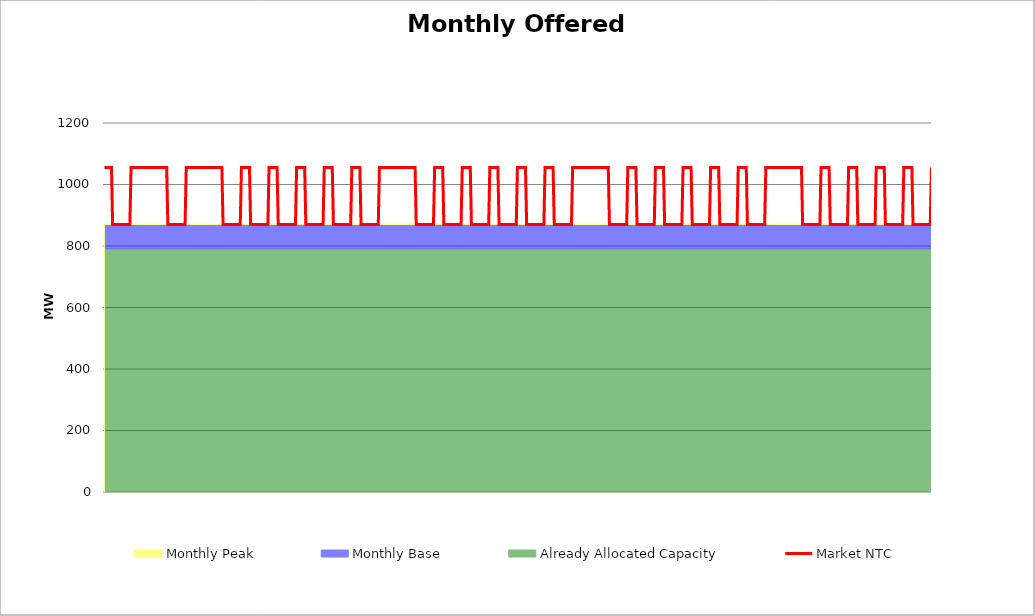
| Category | Market NTC |
|---|---|
| 0 | 1055 |
| 1 | 1055 |
| 2 | 1055 |
| 3 | 1055 |
| 4 | 1055 |
| 5 | 1055 |
| 6 | 1055 |
| 7 | 870 |
| 8 | 870 |
| 9 | 870 |
| 10 | 870 |
| 11 | 870 |
| 12 | 870 |
| 13 | 870 |
| 14 | 870 |
| 15 | 870 |
| 16 | 870 |
| 17 | 870 |
| 18 | 870 |
| 19 | 870 |
| 20 | 870 |
| 21 | 870 |
| 22 | 870 |
| 23 | 1055 |
| 24 | 1055 |
| 25 | 1055 |
| 26 | 1055 |
| 27 | 1055 |
| 28 | 1055 |
| 29 | 1055 |
| 30 | 1055 |
| 31 | 1055 |
| 32 | 1055 |
| 33 | 1055 |
| 34 | 1055 |
| 35 | 1055 |
| 36 | 1055 |
| 37 | 1055 |
| 38 | 1055 |
| 39 | 1055 |
| 40 | 1055 |
| 41 | 1055 |
| 42 | 1055 |
| 43 | 1055 |
| 44 | 1055 |
| 45 | 1055 |
| 46 | 1055 |
| 47 | 1055 |
| 48 | 1055 |
| 49 | 1055 |
| 50 | 1055 |
| 51 | 1055 |
| 52 | 1055 |
| 53 | 1055 |
| 54 | 1055 |
| 55 | 870 |
| 56 | 870 |
| 57 | 870 |
| 58 | 870 |
| 59 | 870 |
| 60 | 870 |
| 61 | 870 |
| 62 | 870 |
| 63 | 870 |
| 64 | 870 |
| 65 | 870 |
| 66 | 870 |
| 67 | 870 |
| 68 | 870 |
| 69 | 870 |
| 70 | 870 |
| 71 | 1055 |
| 72 | 1055 |
| 73 | 1055 |
| 74 | 1055 |
| 75 | 1055 |
| 76 | 1055 |
| 77 | 1055 |
| 78 | 1055 |
| 79 | 1055 |
| 80 | 1055 |
| 81 | 1055 |
| 82 | 1055 |
| 83 | 1055 |
| 84 | 1055 |
| 85 | 1055 |
| 86 | 1055 |
| 87 | 1055 |
| 88 | 1055 |
| 89 | 1055 |
| 90 | 1055 |
| 91 | 1055 |
| 92 | 1055 |
| 93 | 1055 |
| 94 | 1055 |
| 95 | 1055 |
| 96 | 1055 |
| 97 | 1055 |
| 98 | 1055 |
| 99 | 1055 |
| 100 | 1055 |
| 101 | 1055 |
| 102 | 1055 |
| 103 | 870 |
| 104 | 870 |
| 105 | 870 |
| 106 | 870 |
| 107 | 870 |
| 108 | 870 |
| 109 | 870 |
| 110 | 870 |
| 111 | 870 |
| 112 | 870 |
| 113 | 870 |
| 114 | 870 |
| 115 | 870 |
| 116 | 870 |
| 117 | 870 |
| 118 | 870 |
| 119 | 1055 |
| 120 | 1055 |
| 121 | 1055 |
| 122 | 1055 |
| 123 | 1055 |
| 124 | 1055 |
| 125 | 1055 |
| 126 | 1055 |
| 127 | 870 |
| 128 | 870 |
| 129 | 870 |
| 130 | 870 |
| 131 | 870 |
| 132 | 870 |
| 133 | 870 |
| 134 | 870 |
| 135 | 870 |
| 136 | 870 |
| 137 | 870 |
| 138 | 870 |
| 139 | 870 |
| 140 | 870 |
| 141 | 870 |
| 142 | 870 |
| 143 | 1055 |
| 144 | 1055 |
| 145 | 1055 |
| 146 | 1055 |
| 147 | 1055 |
| 148 | 1055 |
| 149 | 1055 |
| 150 | 1055 |
| 151 | 870 |
| 152 | 870 |
| 153 | 870 |
| 154 | 870 |
| 155 | 870 |
| 156 | 870 |
| 157 | 870 |
| 158 | 870 |
| 159 | 870 |
| 160 | 870 |
| 161 | 870 |
| 162 | 870 |
| 163 | 870 |
| 164 | 870 |
| 165 | 870 |
| 166 | 870 |
| 167 | 1055 |
| 168 | 1055 |
| 169 | 1055 |
| 170 | 1055 |
| 171 | 1055 |
| 172 | 1055 |
| 173 | 1055 |
| 174 | 1055 |
| 175 | 870 |
| 176 | 870 |
| 177 | 870 |
| 178 | 870 |
| 179 | 870 |
| 180 | 870 |
| 181 | 870 |
| 182 | 870 |
| 183 | 870 |
| 184 | 870 |
| 185 | 870 |
| 186 | 870 |
| 187 | 870 |
| 188 | 870 |
| 189 | 870 |
| 190 | 870 |
| 191 | 1055 |
| 192 | 1055 |
| 193 | 1055 |
| 194 | 1055 |
| 195 | 1055 |
| 196 | 1055 |
| 197 | 1055 |
| 198 | 1055 |
| 199 | 870 |
| 200 | 870 |
| 201 | 870 |
| 202 | 870 |
| 203 | 870 |
| 204 | 870 |
| 205 | 870 |
| 206 | 870 |
| 207 | 870 |
| 208 | 870 |
| 209 | 870 |
| 210 | 870 |
| 211 | 870 |
| 212 | 870 |
| 213 | 870 |
| 214 | 870 |
| 215 | 1055 |
| 216 | 1055 |
| 217 | 1055 |
| 218 | 1055 |
| 219 | 1055 |
| 220 | 1055 |
| 221 | 1055 |
| 222 | 1055 |
| 223 | 870 |
| 224 | 870 |
| 225 | 870 |
| 226 | 870 |
| 227 | 870 |
| 228 | 870 |
| 229 | 870 |
| 230 | 870 |
| 231 | 870 |
| 232 | 870 |
| 233 | 870 |
| 234 | 870 |
| 235 | 870 |
| 236 | 870 |
| 237 | 870 |
| 238 | 870 |
| 239 | 1055 |
| 240 | 1055 |
| 241 | 1055 |
| 242 | 1055 |
| 243 | 1055 |
| 244 | 1055 |
| 245 | 1055 |
| 246 | 1055 |
| 247 | 1055 |
| 248 | 1055 |
| 249 | 1055 |
| 250 | 1055 |
| 251 | 1055 |
| 252 | 1055 |
| 253 | 1055 |
| 254 | 1055 |
| 255 | 1055 |
| 256 | 1055 |
| 257 | 1055 |
| 258 | 1055 |
| 259 | 1055 |
| 260 | 1055 |
| 261 | 1055 |
| 262 | 1055 |
| 263 | 1055 |
| 264 | 1055 |
| 265 | 1055 |
| 266 | 1055 |
| 267 | 1055 |
| 268 | 1055 |
| 269 | 1055 |
| 270 | 1055 |
| 271 | 870 |
| 272 | 870 |
| 273 | 870 |
| 274 | 870 |
| 275 | 870 |
| 276 | 870 |
| 277 | 870 |
| 278 | 870 |
| 279 | 870 |
| 280 | 870 |
| 281 | 870 |
| 282 | 870 |
| 283 | 870 |
| 284 | 870 |
| 285 | 870 |
| 286 | 870 |
| 287 | 1055 |
| 288 | 1055 |
| 289 | 1055 |
| 290 | 1055 |
| 291 | 1055 |
| 292 | 1055 |
| 293 | 1055 |
| 294 | 1055 |
| 295 | 870 |
| 296 | 870 |
| 297 | 870 |
| 298 | 870 |
| 299 | 870 |
| 300 | 870 |
| 301 | 870 |
| 302 | 870 |
| 303 | 870 |
| 304 | 870 |
| 305 | 870 |
| 306 | 870 |
| 307 | 870 |
| 308 | 870 |
| 309 | 870 |
| 310 | 870 |
| 311 | 1055 |
| 312 | 1055 |
| 313 | 1055 |
| 314 | 1055 |
| 315 | 1055 |
| 316 | 1055 |
| 317 | 1055 |
| 318 | 1055 |
| 319 | 870 |
| 320 | 870 |
| 321 | 870 |
| 322 | 870 |
| 323 | 870 |
| 324 | 870 |
| 325 | 870 |
| 326 | 870 |
| 327 | 870 |
| 328 | 870 |
| 329 | 870 |
| 330 | 870 |
| 331 | 870 |
| 332 | 870 |
| 333 | 870 |
| 334 | 870 |
| 335 | 1055 |
| 336 | 1055 |
| 337 | 1055 |
| 338 | 1055 |
| 339 | 1055 |
| 340 | 1055 |
| 341 | 1055 |
| 342 | 1055 |
| 343 | 870 |
| 344 | 870 |
| 345 | 870 |
| 346 | 870 |
| 347 | 870 |
| 348 | 870 |
| 349 | 870 |
| 350 | 870 |
| 351 | 870 |
| 352 | 870 |
| 353 | 870 |
| 354 | 870 |
| 355 | 870 |
| 356 | 870 |
| 357 | 870 |
| 358 | 870 |
| 359 | 1055 |
| 360 | 1055 |
| 361 | 1055 |
| 362 | 1055 |
| 363 | 1055 |
| 364 | 1055 |
| 365 | 1055 |
| 366 | 1055 |
| 367 | 870 |
| 368 | 870 |
| 369 | 870 |
| 370 | 870 |
| 371 | 870 |
| 372 | 870 |
| 373 | 870 |
| 374 | 870 |
| 375 | 870 |
| 376 | 870 |
| 377 | 870 |
| 378 | 870 |
| 379 | 870 |
| 380 | 870 |
| 381 | 870 |
| 382 | 870 |
| 383 | 1055 |
| 384 | 1055 |
| 385 | 1055 |
| 386 | 1055 |
| 387 | 1055 |
| 388 | 1055 |
| 389 | 1055 |
| 390 | 1055 |
| 391 | 870 |
| 392 | 870 |
| 393 | 870 |
| 394 | 870 |
| 395 | 870 |
| 396 | 870 |
| 397 | 870 |
| 398 | 870 |
| 399 | 870 |
| 400 | 870 |
| 401 | 870 |
| 402 | 870 |
| 403 | 870 |
| 404 | 870 |
| 405 | 870 |
| 406 | 870 |
| 407 | 1055 |
| 408 | 1055 |
| 409 | 1055 |
| 410 | 1055 |
| 411 | 1055 |
| 412 | 1055 |
| 413 | 1055 |
| 414 | 1055 |
| 415 | 1055 |
| 416 | 1055 |
| 417 | 1055 |
| 418 | 1055 |
| 419 | 1055 |
| 420 | 1055 |
| 421 | 1055 |
| 422 | 1055 |
| 423 | 1055 |
| 424 | 1055 |
| 425 | 1055 |
| 426 | 1055 |
| 427 | 1055 |
| 428 | 1055 |
| 429 | 1055 |
| 430 | 1055 |
| 431 | 1055 |
| 432 | 1055 |
| 433 | 1055 |
| 434 | 1055 |
| 435 | 1055 |
| 436 | 1055 |
| 437 | 1055 |
| 438 | 1055 |
| 439 | 870 |
| 440 | 870 |
| 441 | 870 |
| 442 | 870 |
| 443 | 870 |
| 444 | 870 |
| 445 | 870 |
| 446 | 870 |
| 447 | 870 |
| 448 | 870 |
| 449 | 870 |
| 450 | 870 |
| 451 | 870 |
| 452 | 870 |
| 453 | 870 |
| 454 | 870 |
| 455 | 1055 |
| 456 | 1055 |
| 457 | 1055 |
| 458 | 1055 |
| 459 | 1055 |
| 460 | 1055 |
| 461 | 1055 |
| 462 | 1055 |
| 463 | 870 |
| 464 | 870 |
| 465 | 870 |
| 466 | 870 |
| 467 | 870 |
| 468 | 870 |
| 469 | 870 |
| 470 | 870 |
| 471 | 870 |
| 472 | 870 |
| 473 | 870 |
| 474 | 870 |
| 475 | 870 |
| 476 | 870 |
| 477 | 870 |
| 478 | 870 |
| 479 | 1055 |
| 480 | 1055 |
| 481 | 1055 |
| 482 | 1055 |
| 483 | 1055 |
| 484 | 1055 |
| 485 | 1055 |
| 486 | 1055 |
| 487 | 870 |
| 488 | 870 |
| 489 | 870 |
| 490 | 870 |
| 491 | 870 |
| 492 | 870 |
| 493 | 870 |
| 494 | 870 |
| 495 | 870 |
| 496 | 870 |
| 497 | 870 |
| 498 | 870 |
| 499 | 870 |
| 500 | 870 |
| 501 | 870 |
| 502 | 870 |
| 503 | 1055 |
| 504 | 1055 |
| 505 | 1055 |
| 506 | 1055 |
| 507 | 1055 |
| 508 | 1055 |
| 509 | 1055 |
| 510 | 1055 |
| 511 | 870 |
| 512 | 870 |
| 513 | 870 |
| 514 | 870 |
| 515 | 870 |
| 516 | 870 |
| 517 | 870 |
| 518 | 870 |
| 519 | 870 |
| 520 | 870 |
| 521 | 870 |
| 522 | 870 |
| 523 | 870 |
| 524 | 870 |
| 525 | 870 |
| 526 | 870 |
| 527 | 1055 |
| 528 | 1055 |
| 529 | 1055 |
| 530 | 1055 |
| 531 | 1055 |
| 532 | 1055 |
| 533 | 1055 |
| 534 | 1055 |
| 535 | 870 |
| 536 | 870 |
| 537 | 870 |
| 538 | 870 |
| 539 | 870 |
| 540 | 870 |
| 541 | 870 |
| 542 | 870 |
| 543 | 870 |
| 544 | 870 |
| 545 | 870 |
| 546 | 870 |
| 547 | 870 |
| 548 | 870 |
| 549 | 870 |
| 550 | 870 |
| 551 | 1055 |
| 552 | 1055 |
| 553 | 1055 |
| 554 | 1055 |
| 555 | 1055 |
| 556 | 1055 |
| 557 | 1055 |
| 558 | 1055 |
| 559 | 870 |
| 560 | 870 |
| 561 | 870 |
| 562 | 870 |
| 563 | 870 |
| 564 | 870 |
| 565 | 870 |
| 566 | 870 |
| 567 | 870 |
| 568 | 870 |
| 569 | 870 |
| 570 | 870 |
| 571 | 870 |
| 572 | 870 |
| 573 | 870 |
| 574 | 870 |
| 575 | 1055 |
| 576 | 1055 |
| 577 | 1055 |
| 578 | 1055 |
| 579 | 1055 |
| 580 | 1055 |
| 581 | 1055 |
| 582 | 1055 |
| 583 | 1055 |
| 584 | 1055 |
| 585 | 1055 |
| 586 | 1055 |
| 587 | 1055 |
| 588 | 1055 |
| 589 | 1055 |
| 590 | 1055 |
| 591 | 1055 |
| 592 | 1055 |
| 593 | 1055 |
| 594 | 1055 |
| 595 | 1055 |
| 596 | 1055 |
| 597 | 1055 |
| 598 | 1055 |
| 599 | 1055 |
| 600 | 1055 |
| 601 | 1055 |
| 602 | 1055 |
| 603 | 1055 |
| 604 | 1055 |
| 605 | 1055 |
| 606 | 1055 |
| 607 | 870 |
| 608 | 870 |
| 609 | 870 |
| 610 | 870 |
| 611 | 870 |
| 612 | 870 |
| 613 | 870 |
| 614 | 870 |
| 615 | 870 |
| 616 | 870 |
| 617 | 870 |
| 618 | 870 |
| 619 | 870 |
| 620 | 870 |
| 621 | 870 |
| 622 | 870 |
| 623 | 1055 |
| 624 | 1055 |
| 625 | 1055 |
| 626 | 1055 |
| 627 | 1055 |
| 628 | 1055 |
| 629 | 1055 |
| 630 | 1055 |
| 631 | 870 |
| 632 | 870 |
| 633 | 870 |
| 634 | 870 |
| 635 | 870 |
| 636 | 870 |
| 637 | 870 |
| 638 | 870 |
| 639 | 870 |
| 640 | 870 |
| 641 | 870 |
| 642 | 870 |
| 643 | 870 |
| 644 | 870 |
| 645 | 870 |
| 646 | 870 |
| 647 | 1055 |
| 648 | 1055 |
| 649 | 1055 |
| 650 | 1055 |
| 651 | 1055 |
| 652 | 1055 |
| 653 | 1055 |
| 654 | 1055 |
| 655 | 870 |
| 656 | 870 |
| 657 | 870 |
| 658 | 870 |
| 659 | 870 |
| 660 | 870 |
| 661 | 870 |
| 662 | 870 |
| 663 | 870 |
| 664 | 870 |
| 665 | 870 |
| 666 | 870 |
| 667 | 870 |
| 668 | 870 |
| 669 | 870 |
| 670 | 870 |
| 671 | 1055 |
| 672 | 1055 |
| 673 | 1055 |
| 674 | 1055 |
| 675 | 1055 |
| 676 | 1055 |
| 677 | 1055 |
| 678 | 1055 |
| 679 | 870 |
| 680 | 870 |
| 681 | 870 |
| 682 | 870 |
| 683 | 870 |
| 684 | 870 |
| 685 | 870 |
| 686 | 870 |
| 687 | 870 |
| 688 | 870 |
| 689 | 870 |
| 690 | 870 |
| 691 | 870 |
| 692 | 870 |
| 693 | 870 |
| 694 | 870 |
| 695 | 1055 |
| 696 | 1055 |
| 697 | 1055 |
| 698 | 1055 |
| 699 | 1055 |
| 700 | 1055 |
| 701 | 1055 |
| 702 | 1055 |
| 703 | 870 |
| 704 | 870 |
| 705 | 870 |
| 706 | 870 |
| 707 | 870 |
| 708 | 870 |
| 709 | 870 |
| 710 | 870 |
| 711 | 870 |
| 712 | 870 |
| 713 | 870 |
| 714 | 870 |
| 715 | 870 |
| 716 | 870 |
| 717 | 870 |
| 718 | 870 |
| 719 | 1055 |